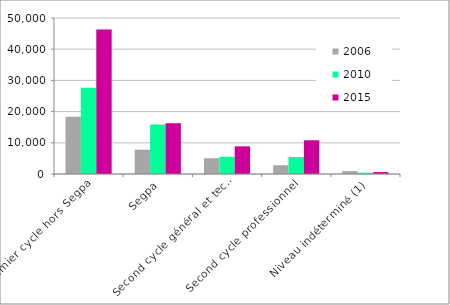
| Category | 2006 | 2010 | 2015 |
|---|---|---|---|
| Premier cycle hors Segpa | 18348 | 27645 | 46327 |
| Segpa | 7790 | 15861 | 16269 |
| Second cycle général et technologique | 5048 | 5516 | 8854 |
| Second cycle professionnel | 2817 | 5432 | 10809 |
| Niveau indéterminé (1) | 925 | 411 | 616 |